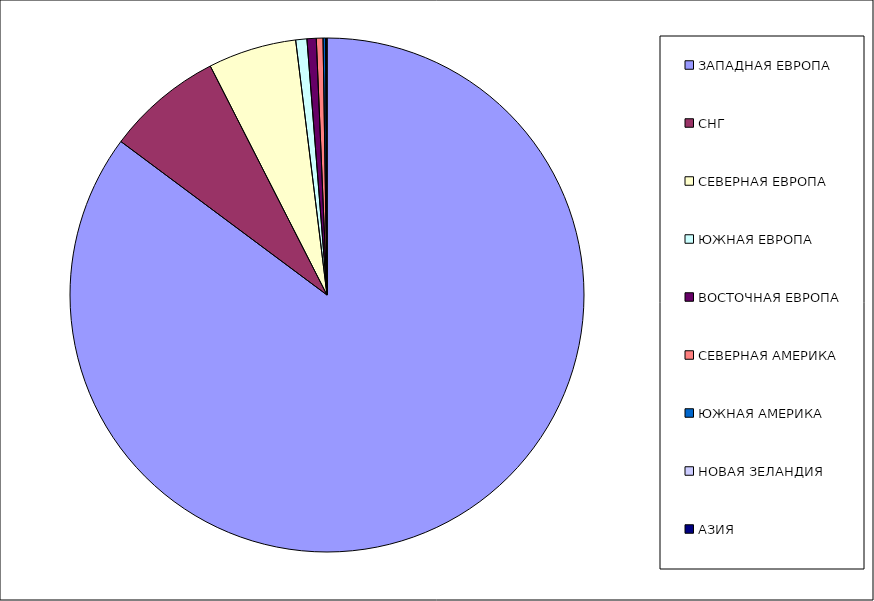
| Category | Оборот |
|---|---|
| ЗАПАДНАЯ ЕВРОПА | 0.852 |
| СНГ | 0.073 |
| СЕВЕРНАЯ ЕВРОПА | 0.056 |
| ЮЖНАЯ ЕВРОПА | 0.007 |
| ВОСТОЧНАЯ ЕВРОПА | 0.006 |
| СЕВЕРНАЯ АМЕРИКА | 0.004 |
| ЮЖНАЯ АМЕРИКА | 0.002 |
| НОВАЯ ЗЕЛАНДИЯ | 0.001 |
| АЗИЯ | 0 |